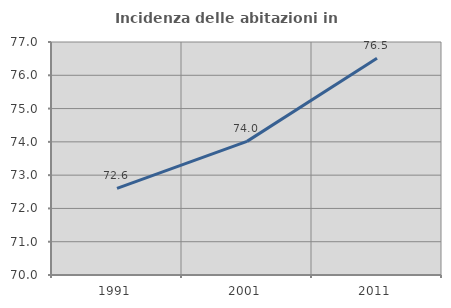
| Category | Incidenza delle abitazioni in proprietà  |
|---|---|
| 1991.0 | 72.6 |
| 2001.0 | 74.015 |
| 2011.0 | 76.514 |